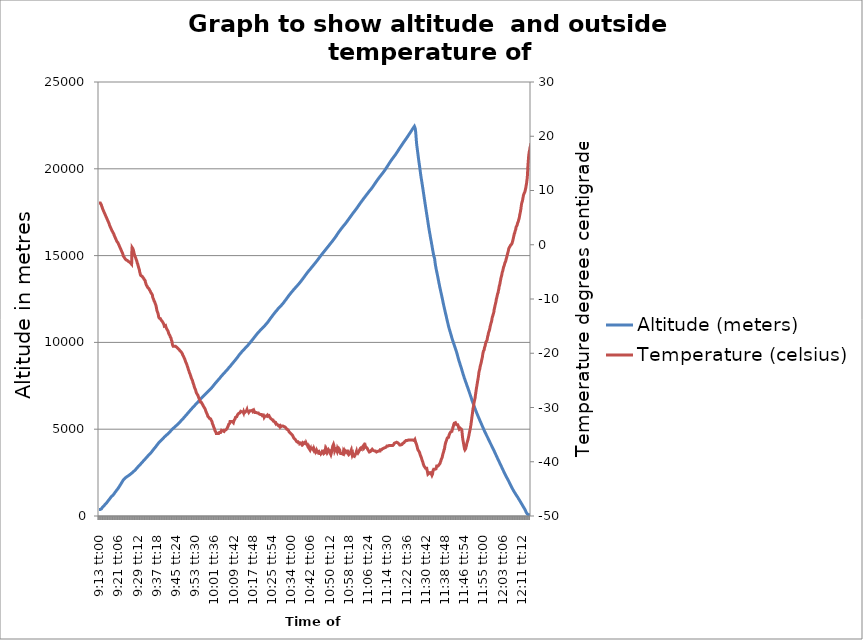
| Category | Altitude (meters)   |
|---|---|
| 0.3840277777777778 | 380 |
| 0.38409722222222226 | 380 |
| 0.3841666666666667 | 380 |
| 0.38423611111111117 | 380 |
| 0.3843055555555555 | 380 |
| 0.38437499999999997 | 380 |
| 0.3844444444444444 | 380 |
| 0.3845138888888889 | 380 |
| 0.38458333333333333 | 383 |
| 0.3846527777777778 | 399 |
| 0.384722222222222 | 414 |
| 0.384791666666667 | 437 |
| 0.384861111111111 | 460 |
| 0.384930555555556 | 481 |
| 0.385 | 501 |
| 0.385069444444445 | 513 |
| 0.385138888888889 | 529 |
| 0.385208333333334 | 540 |
| 0.385277777777778 | 552 |
| 0.385347222222222 | 566 |
| 0.385416666666667 | 584 |
| 0.385486111111111 | 598 |
| 0.385555555555556 | 613 |
| 0.385625 | 630 |
| 0.385694444444445 | 645 |
| 0.385763888888889 | 662 |
| 0.385833333333334 | 676 |
| 0.385902777777778 | 692 |
| 0.385972222222223 | 706 |
| 0.386041666666667 | 720 |
| 0.386111111111111 | 734 |
| 0.386180555555556 | 749 |
| 0.38625 | 764 |
| 0.386319444444445 | 782 |
| 0.386388888888889 | 798 |
| 0.386458333333334 | 822 |
| 0.386527777777778 | 840 |
| 0.386597222222223 | 856 |
| 0.386666666666667 | 872 |
| 0.386736111111112 | 891 |
| 0.386805555555556 | 908 |
| 0.386875 | 923 |
| 0.386944444444445 | 941 |
| 0.387013888888889 | 957 |
| 0.387083333333334 | 980 |
| 0.387152777777778 | 1004 |
| 0.387222222222223 | 1024 |
| 0.387291666666667 | 1037 |
| 0.387361111111112 | 1050 |
| 0.387430555555556 | 1070 |
| 0.387500000000001 | 1088 |
| 0.387569444444445 | 1106 |
| 0.387638888888889 | 1124 |
| 0.387708333333334 | 1138 |
| 0.387777777777778 | 1152 |
| 0.387847222222223 | 1165 |
| 0.387916666666667 | 1172 |
| 0.387986111111112 | 1179 |
| 0.388055555555556 | 1189 |
| 0.388125000000001 | 1202 |
| 0.388194444444445 | 1218 |
| 0.38826388888889 | 1238 |
| 0.388333333333334 | 1263 |
| 0.388402777777778 | 1284 |
| 0.388472222222223 | 1300 |
| 0.388541666666667 | 1318 |
| 0.388611111111112 | 1339 |
| 0.388680555555556 | 1358 |
| 0.388750000000001 | 1376 |
| 0.388819444444445 | 1389 |
| 0.38888888888889 | 1409 |
| 0.388958333333334 | 1428 |
| 0.389027777777779 | 1448 |
| 0.389097222222223 | 1465 |
| 0.389166666666667 | 1483 |
| 0.389236111111112 | 1504 |
| 0.389305555555556 | 1521 |
| 0.389375 | 1538 |
| 0.3894444444444445 | 1553 |
| 0.3895138888888889 | 1572 |
| 0.38958333333333334 | 1592 |
| 0.3896527777777778 | 1612 |
| 0.38972222222222225 | 1632 |
| 0.3897916666666667 | 1655 |
| 0.38986111111111116 | 1679 |
| 0.3899305555555555 | 1701 |
| 0.38999999999999996 | 1719 |
| 0.3900694444444444 | 1737 |
| 0.39013888888888887 | 1761 |
| 0.3902083333333333 | 1786 |
| 0.3902777777777778 | 1806 |
| 0.39034722222222223 | 1829 |
| 0.39041666666666663 | 1852 |
| 0.3904861111111111 | 1871 |
| 0.39055555555555554 | 1893 |
| 0.390625 | 1915 |
| 0.39069444444444446 | 1940 |
| 0.3907638888888889 | 1965 |
| 0.39083333333333337 | 1988 |
| 0.39090277777777777 | 2010 |
| 0.3909722222222222 | 2033 |
| 0.3910416666666667 | 2058 |
| 0.39111111111111113 | 2080 |
| 0.3911805555555556 | 2096 |
| 0.39125000000000004 | 2108 |
| 0.3913194444444445 | 2122 |
| 0.39138888888888884 | 2134 |
| 0.3914583333333333 | 2148 |
| 0.39152777777777775 | 2160 |
| 0.3915972222222222 | 2171 |
| 0.39166666666666666 | 2185 |
| 0.3917361111111111 | 2197 |
| 0.3918055555555555 | 2211 |
| 0.391875 | 2222 |
| 0.39194444444444443 | 2234 |
| 0.3920138888888889 | 2245 |
| 0.39208333333333334 | 2255 |
| 0.3921527777777778 | 2264 |
| 0.39222222222222225 | 2274 |
| 0.39229166666666665 | 2283 |
| 0.3923611111111111 | 2292 |
| 0.39243055555555556 | 2301 |
| 0.3925 | 2311 |
| 0.39256944444444447 | 2319 |
| 0.3926388888888889 | 2329 |
| 0.3927083333333334 | 2339 |
| 0.3927777777777777 | 2346 |
| 0.3928472222222222 | 2357 |
| 0.39291666666666664 | 2366 |
| 0.3929861111111111 | 2377 |
| 0.39305555555555555 | 2387 |
| 0.393125 | 2397 |
| 0.39319444444444446 | 2408 |
| 0.39326388888888886 | 2419 |
| 0.3933333333333333 | 2432 |
| 0.39340277777777777 | 2442 |
| 0.3934722222222222 | 2454 |
| 0.3935416666666667 | 2465 |
| 0.39361111111111113 | 2475 |
| 0.3936805555555556 | 2487 |
| 0.39375 | 2498 |
| 0.39381944444444444 | 2511 |
| 0.3938888888888889 | 2523 |
| 0.39395833333333335 | 2536 |
| 0.3940277777777778 | 2547 |
| 0.39409722222222227 | 2560 |
| 0.3941666666666667 | 2572 |
| 0.39423611111111106 | 2584 |
| 0.3943055555555555 | 2597 |
| 0.394375 | 2609 |
| 0.39444444444444443 | 2622 |
| 0.3945138888888889 | 2635 |
| 0.39458333333333334 | 2649 |
| 0.3946527777777778 | 2664 |
| 0.3947222222222222 | 2678 |
| 0.39479166666666665 | 2692 |
| 0.3948611111111111 | 2707 |
| 0.39493055555555556 | 2723 |
| 0.395 | 2736 |
| 0.3950694444444445 | 2751 |
| 0.3951388888888889 | 2769 |
| 0.39520833333333333 | 2786 |
| 0.3952777777777778 | 2801 |
| 0.39534722222222224 | 2820 |
| 0.3954166666666667 | 2839 |
| 0.39548611111111115 | 2855 |
| 0.3955555555555556 | 2871 |
| 0.39562499999999995 | 2885 |
| 0.3956944444444444 | 2899 |
| 0.39576388888888886 | 2912 |
| 0.3958333333333333 | 2924 |
| 0.39590277777777777 | 2937 |
| 0.3959722222222222 | 2950 |
| 0.3960416666666667 | 2963 |
| 0.3961111111111111 | 2978 |
| 0.39618055555555554 | 2993 |
| 0.39625 | 3009 |
| 0.39631944444444445 | 3024 |
| 0.3963888888888889 | 3040 |
| 0.39645833333333336 | 3056 |
| 0.3965277777777778 | 3072 |
| 0.3965972222222222 | 3086 |
| 0.39666666666666667 | 3101 |
| 0.3967361111111111 | 3116 |
| 0.3968055555555556 | 3131 |
| 0.39687500000000003 | 3147 |
| 0.3969444444444445 | 3162 |
| 0.39701388888888883 | 3177 |
| 0.3970833333333333 | 3192 |
| 0.39715277777777774 | 3207 |
| 0.3972222222222222 | 3222 |
| 0.39729166666666665 | 3236 |
| 0.3973611111111111 | 3250 |
| 0.39743055555555556 | 3265 |
| 0.39749999999999996 | 3280 |
| 0.3975694444444444 | 3297 |
| 0.3976388888888889 | 3314 |
| 0.39770833333333333 | 3329 |
| 0.3977777777777778 | 3345 |
| 0.39784722222222224 | 3359 |
| 0.3979166666666667 | 3374 |
| 0.3979861111111111 | 3389 |
| 0.39805555555555555 | 3404 |
| 0.398125 | 3419 |
| 0.39819444444444446 | 3435 |
| 0.3982638888888889 | 3451 |
| 0.3983333333333334 | 3466 |
| 0.39840277777777783 | 3480 |
| 0.39847222222222217 | 3494 |
| 0.3985416666666666 | 3508 |
| 0.3986111111111111 | 3523 |
| 0.39868055555555554 | 3538 |
| 0.39875 | 3554 |
| 0.39881944444444445 | 3568 |
| 0.3988888888888889 | 3582 |
| 0.3989583333333333 | 3594 |
| 0.39902777777777776 | 3608 |
| 0.3990972222222222 | 3622 |
| 0.39916666666666667 | 3637 |
| 0.3992361111111111 | 3653 |
| 0.3993055555555556 | 3669 |
| 0.39937500000000004 | 3687 |
| 0.39944444444444444 | 3703 |
| 0.3995138888888889 | 3724 |
| 0.39958333333333335 | 3741 |
| 0.3996527777777778 | 3759 |
| 0.39972222222222226 | 3780 |
| 0.3997916666666667 | 3795 |
| 0.39986111111111106 | 3811 |
| 0.3999305555555555 | 3826 |
| 0.39999999999999997 | 3843 |
| 0.4000694444444444 | 3861 |
| 0.4001388888888889 | 3878 |
| 0.40020833333333333 | 3895 |
| 0.4002777777777778 | 3911 |
| 0.4003472222222222 | 3928 |
| 0.40041666666666664 | 3944 |
| 0.4004861111111111 | 3962 |
| 0.40055555555555555 | 3978 |
| 0.400625 | 3997 |
| 0.40069444444444446 | 4014 |
| 0.4007638888888889 | 4033 |
| 0.4008333333333333 | 4052 |
| 0.4009027777777778 | 4072 |
| 0.40097222222222223 | 4088 |
| 0.4010416666666667 | 4107 |
| 0.40111111111111114 | 4126 |
| 0.4011805555555556 | 4141 |
| 0.40125000000000005 | 4160 |
| 0.4013194444444444 | 4175 |
| 0.40138888888888885 | 4193 |
| 0.4014583333333333 | 4213 |
| 0.40152777777777776 | 4227 |
| 0.4015972222222222 | 4242 |
| 0.40166666666666667 | 4257 |
| 0.4017361111111111 | 4271 |
| 0.4018055555555555 | 4284 |
| 0.401875 | 4298 |
| 0.40194444444444444 | 4302 |
| 0.4020138888888889 | 4327 |
| 0.40208333333333335 | 4341 |
| 0.4021527777777778 | 4355 |
| 0.40222222222222226 | 4369 |
| 0.40229166666666666 | 4382 |
| 0.4023611111111111 | 4397 |
| 0.40243055555555557 | 4409 |
| 0.4025 | 4425 |
| 0.4025694444444445 | 4439 |
| 0.40263888888888894 | 4451 |
| 0.4027083333333333 | 4463 |
| 0.40277777777777773 | 4475 |
| 0.4028472222222222 | 4489 |
| 0.40291666666666665 | 4504 |
| 0.4029861111111111 | 4521 |
| 0.40305555555555556 | 4537 |
| 0.403125 | 4552 |
| 0.4031944444444444 | 4566 |
| 0.40326388888888887 | 4579 |
| 0.4033333333333333 | 4591 |
| 0.4034027777777778 | 4602 |
| 0.40347222222222223 | 4615 |
| 0.4035416666666667 | 4626 |
| 0.40361111111111114 | 4638 |
| 0.40368055555555554 | 4649 |
| 0.40375 | 4661 |
| 0.40381944444444445 | 4673 |
| 0.4038888888888889 | 4687 |
| 0.40395833333333336 | 4699 |
| 0.4040277777777778 | 4710 |
| 0.4040972222222223 | 4722 |
| 0.4041666666666666 | 4735 |
| 0.4042361111111111 | 4748 |
| 0.40430555555555553 | 4761 |
| 0.404375 | 4775 |
| 0.40444444444444444 | 4789 |
| 0.4045138888888889 | 4803 |
| 0.40458333333333335 | 4817 |
| 0.40465277777777775 | 4830 |
| 0.4047222222222222 | 4842 |
| 0.40479166666666666 | 4855 |
| 0.4048611111111111 | 4869 |
| 0.40493055555555557 | 4887 |
| 0.405 | 4905 |
| 0.4050694444444444 | 4920 |
| 0.4051388888888889 | 4937 |
| 0.40520833333333334 | 4952 |
| 0.4052777777777778 | 4965 |
| 0.40534722222222225 | 4980 |
| 0.4054166666666667 | 4997 |
| 0.40548611111111116 | 5015 |
| 0.4055555555555555 | 5026 |
| 0.40562499999999996 | 5036 |
| 0.4056944444444444 | 5047 |
| 0.40576388888888887 | 5059 |
| 0.4058333333333333 | 5072 |
| 0.4059027777777778 | 5083 |
| 0.40597222222222223 | 5093 |
| 0.40604166666666663 | 5104 |
| 0.4061111111111111 | 5116 |
| 0.40618055555555554 | 5128 |
| 0.40625 | 5140 |
| 0.40631944444444446 | 5152 |
| 0.4063888888888889 | 5165 |
| 0.40645833333333337 | 5178 |
| 0.40652777777777777 | 5192 |
| 0.4065972222222222 | 5205 |
| 0.4066666666666667 | 5217 |
| 0.40673611111111113 | 5230 |
| 0.4068055555555556 | 5243 |
| 0.40687500000000004 | 5256 |
| 0.4069444444444445 | 5269 |
| 0.40701388888888884 | 5282 |
| 0.4070833333333333 | 5296 |
| 0.40715277777777775 | 5310 |
| 0.4072222222222222 | 5324 |
| 0.40729166666666666 | 5337 |
| 0.4073611111111111 | 5351 |
| 0.4074305555555556 | 5366 |
| 0.4075 | 5380 |
| 0.40756944444444443 | 5393 |
| 0.4076388888888889 | 5407 |
| 0.40770833333333334 | 5421 |
| 0.4077777777777778 | 5435 |
| 0.40784722222222225 | 5449 |
| 0.40791666666666665 | 5463 |
| 0.4079861111111111 | 5477 |
| 0.40805555555555556 | 5492 |
| 0.408125 | 5507 |
| 0.40819444444444447 | 5519 |
| 0.4082638888888889 | 5536 |
| 0.4083333333333334 | 5551 |
| 0.4084027777777777 | 5566 |
| 0.4084722222222222 | 5581 |
| 0.40854166666666664 | 5596 |
| 0.4086111111111111 | 5611 |
| 0.40868055555555555 | 5626 |
| 0.40875 | 5641 |
| 0.40881944444444446 | 5658 |
| 0.40888888888888886 | 5673 |
| 0.4089583333333333 | 5688 |
| 0.40902777777777777 | 5704 |
| 0.4090972222222222 | 5721 |
| 0.4091666666666667 | 5736 |
| 0.40923611111111113 | 5752 |
| 0.4093055555555556 | 5767 |
| 0.409375 | 5782 |
| 0.40944444444444444 | 5798 |
| 0.4095138888888889 | 5814 |
| 0.40958333333333335 | 5830 |
| 0.4096527777777778 | 5845 |
| 0.40972222222222227 | 5861 |
| 0.4097916666666667 | 5876 |
| 0.40986111111111106 | 5890 |
| 0.4099305555555555 | 5906 |
| 0.41 | 5922 |
| 0.41006944444444443 | 5938 |
| 0.4101388888888889 | 5956 |
| 0.41020833333333334 | 5972 |
| 0.41027777777777774 | 5988 |
| 0.4103472222222222 | 6004 |
| 0.41041666666666665 | 6020 |
| 0.4104861111111111 | 6036 |
| 0.41055555555555556 | 6050 |
| 0.410625 | 6066 |
| 0.4106944444444445 | 6081 |
| 0.4107638888888889 | 6097 |
| 0.41083333333333333 | 6114 |
| 0.4109027777777778 | 6133 |
| 0.41097222222222224 | 6148 |
| 0.4110416666666667 | 6164 |
| 0.41111111111111115 | 6178 |
| 0.4111805555555556 | 6192 |
| 0.41124999999999995 | 6206 |
| 0.4113194444444444 | 6220 |
| 0.41138888888888886 | 6235 |
| 0.4114583333333333 | 6250 |
| 0.41152777777777777 | 6266 |
| 0.4115972222222222 | 6280 |
| 0.4116666666666667 | 6294 |
| 0.4117361111111111 | 6308 |
| 0.41180555555555554 | 6324 |
| 0.411875 | 6340 |
| 0.41194444444444445 | 6354 |
| 0.4120138888888889 | 6369 |
| 0.41208333333333336 | 6384 |
| 0.4121527777777778 | 6398 |
| 0.4122222222222222 | 6413 |
| 0.41229166666666667 | 6428 |
| 0.4123611111111111 | 6441 |
| 0.4124305555555556 | 6458 |
| 0.41250000000000003 | 6472 |
| 0.4125694444444445 | 6486 |
| 0.41263888888888894 | 6501 |
| 0.4127083333333333 | 6515 |
| 0.41277777777777774 | 6529 |
| 0.4128472222222222 | 6542 |
| 0.41291666666666665 | 6558 |
| 0.4129861111111111 | 6574 |
| 0.41305555555555556 | 6591 |
| 0.41312499999999996 | 6606 |
| 0.4131944444444444 | 6623 |
| 0.4132638888888889 | 6639 |
| 0.41333333333333333 | 6653 |
| 0.4134027777777778 | 6669 |
| 0.41347222222222224 | 6684 |
| 0.4135416666666667 | 6700 |
| 0.4136111111111111 | 6715 |
| 0.41368055555555555 | 6730 |
| 0.41375 | 6744 |
| 0.41381944444444446 | 6759 |
| 0.4138888888888889 | 6773 |
| 0.4139583333333334 | 6787 |
| 0.41402777777777783 | 6801 |
| 0.41409722222222217 | 6815 |
| 0.4141666666666666 | 6830 |
| 0.4142361111111111 | 6844 |
| 0.41430555555555554 | 6856 |
| 0.414375 | 6869 |
| 0.41444444444444445 | 6883 |
| 0.4145138888888889 | 6897 |
| 0.4145833333333333 | 6911 |
| 0.41465277777777776 | 6926 |
| 0.4147222222222222 | 6940 |
| 0.41479166666666667 | 6954 |
| 0.4148611111111111 | 6966 |
| 0.4149305555555556 | 6980 |
| 0.41500000000000004 | 6993 |
| 0.41506944444444444 | 7007 |
| 0.4151388888888889 | 7020 |
| 0.41520833333333335 | 7032 |
| 0.4152777777777778 | 7045 |
| 0.41534722222222226 | 7061 |
| 0.4154166666666667 | 7075 |
| 0.41548611111111106 | 7089 |
| 0.4155555555555555 | 7103 |
| 0.41562499999999997 | 7117 |
| 0.4156944444444444 | 7132 |
| 0.4157638888888889 | 7146 |
| 0.41583333333333333 | 7157 |
| 0.4159027777777778 | 7171 |
| 0.4159722222222222 | 7182 |
| 0.41604166666666664 | 7194 |
| 0.4161111111111111 | 7209 |
| 0.41618055555555555 | 7222 |
| 0.41625 | 7235 |
| 0.41631944444444446 | 7249 |
| 0.4163888888888889 | 7262 |
| 0.4164583333333333 | 7275 |
| 0.4165277777777778 | 7289 |
| 0.41659722222222223 | 7304 |
| 0.4166666666666667 | 7318 |
| 0.41673611111111114 | 7331 |
| 0.4168055555555556 | 7345 |
| 0.41687500000000005 | 7359 |
| 0.4169444444444444 | 7376 |
| 0.41701388888888885 | 7393 |
| 0.4170833333333333 | 7412 |
| 0.41715277777777776 | 7431 |
| 0.4172222222222222 | 7445 |
| 0.41729166666666667 | 7462 |
| 0.4173611111111111 | 7476 |
| 0.4174305555555555 | 7494 |
| 0.4175 | 7511 |
| 0.41756944444444444 | 7529 |
| 0.4176388888888889 | 7545 |
| 0.41770833333333335 | 7562 |
| 0.4177777777777778 | 7580 |
| 0.41784722222222226 | 7598 |
| 0.41791666666666666 | 7616 |
| 0.4179861111111111 | 7634 |
| 0.41805555555555557 | 7648 |
| 0.418125 | 7663 |
| 0.4181944444444445 | 7678 |
| 0.41826388888888894 | 7695 |
| 0.4183333333333333 | 7713 |
| 0.41840277777777773 | 7729 |
| 0.4184722222222222 | 7745 |
| 0.41854166666666665 | 7760 |
| 0.4186111111111111 | 7775 |
| 0.41868055555555556 | 7788 |
| 0.41875 | 7805 |
| 0.4188194444444444 | 7821 |
| 0.41888888888888887 | 7838 |
| 0.4189583333333333 | 7854 |
| 0.4190277777777778 | 7873 |
| 0.41909722222222223 | 7888 |
| 0.4191666666666667 | 7902 |
| 0.41923611111111114 | 7919 |
| 0.41930555555555554 | 7933 |
| 0.419375 | 7944 |
| 0.41944444444444445 | 7963 |
| 0.4195138888888889 | 7980 |
| 0.41958333333333336 | 7998 |
| 0.4196527777777778 | 8016 |
| 0.4197222222222223 | 8035 |
| 0.4197916666666666 | 8049 |
| 0.4198611111111111 | 8064 |
| 0.41993055555555553 | 8080 |
| 0.42 | 8095 |
| 0.42006944444444444 | 8112 |
| 0.4201388888888889 | 8128 |
| 0.42020833333333335 | 8144 |
| 0.42027777777777775 | 8159 |
| 0.4203472222222222 | 8173 |
| 0.42041666666666666 | 8187 |
| 0.4204861111111111 | 8202 |
| 0.42055555555555557 | 8217 |
| 0.420625 | 8233 |
| 0.4206944444444444 | 8246 |
| 0.4207638888888889 | 8262 |
| 0.42083333333333334 | 8277 |
| 0.4209027777777778 | 8291 |
| 0.42097222222222225 | 8305 |
| 0.4210416666666667 | 8321 |
| 0.42111111111111116 | 8337 |
| 0.4211805555555555 | 8352 |
| 0.42124999999999996 | 8367 |
| 0.4213194444444444 | 8381 |
| 0.42138888888888887 | 8397 |
| 0.4214583333333333 | 8412 |
| 0.4215277777777778 | 8427 |
| 0.42159722222222223 | 8442 |
| 0.42166666666666663 | 8457 |
| 0.4217361111111111 | 8474 |
| 0.42180555555555554 | 8491 |
| 0.421875 | 8509 |
| 0.42194444444444446 | 8527 |
| 0.4220138888888889 | 8541 |
| 0.42208333333333337 | 8556 |
| 0.42215277777777777 | 8571 |
| 0.4222222222222222 | 8587 |
| 0.4222916666666667 | 8602 |
| 0.42236111111111113 | 8617 |
| 0.4224305555555556 | 8633 |
| 0.42250000000000004 | 8650 |
| 0.4225694444444445 | 8667 |
| 0.42263888888888884 | 8685 |
| 0.4227083333333333 | 8702 |
| 0.42277777777777775 | 8720 |
| 0.4228472222222222 | 8735 |
| 0.42291666666666666 | 8752 |
| 0.4229861111111111 | 8769 |
| 0.4230555555555555 | 8786 |
| 0.423125 | 8802 |
| 0.42319444444444443 | 8818 |
| 0.4232638888888889 | 8836 |
| 0.42333333333333334 | 8852 |
| 0.4234027777777778 | 8867 |
| 0.42347222222222225 | 8884 |
| 0.42354166666666665 | 8900 |
| 0.4236111111111111 | 8916 |
| 0.42368055555555556 | 8933 |
| 0.42375 | 8949 |
| 0.42381944444444447 | 8965 |
| 0.4238888888888889 | 8982 |
| 0.4239583333333334 | 8999 |
| 0.4240277777777777 | 9016 |
| 0.4240972222222222 | 9032 |
| 0.42416666666666664 | 9050 |
| 0.4242361111111111 | 9067 |
| 0.42430555555555555 | 9084 |
| 0.424375 | 9104 |
| 0.42444444444444446 | 9122 |
| 0.42451388888888886 | 9141 |
| 0.4245833333333333 | 9160 |
| 0.42465277777777777 | 9179 |
| 0.4247222222222222 | 9194 |
| 0.4247916666666667 | 9215 |
| 0.42486111111111113 | 9234 |
| 0.4249305555555556 | 9253 |
| 0.425 | 9272 |
| 0.42506944444444444 | 9288 |
| 0.4251388888888889 | 9304 |
| 0.42520833333333335 | 9321 |
| 0.4252777777777778 | 9338 |
| 0.42534722222222227 | 9354 |
| 0.4254166666666667 | 9370 |
| 0.42548611111111106 | 9385 |
| 0.4255555555555555 | 9401 |
| 0.425625 | 9416 |
| 0.42569444444444443 | 9433 |
| 0.4257638888888889 | 9453 |
| 0.42583333333333334 | 9469 |
| 0.4259027777777778 | 9485 |
| 0.4259722222222222 | 9500 |
| 0.42604166666666665 | 9514 |
| 0.4261111111111111 | 9527 |
| 0.42618055555555556 | 9541 |
| 0.42625 | 9555 |
| 0.4263194444444445 | 9570 |
| 0.4263888888888889 | 9584 |
| 0.42645833333333333 | 9599 |
| 0.4265277777777778 | 9613 |
| 0.42659722222222224 | 9628 |
| 0.4266666666666667 | 9643 |
| 0.42673611111111115 | 9655 |
| 0.4268055555555556 | 9673 |
| 0.42687499999999995 | 9686 |
| 0.4269444444444444 | 9700 |
| 0.42701388888888886 | 9714 |
| 0.4270833333333333 | 9728 |
| 0.42715277777777777 | 9742 |
| 0.4272222222222222 | 9756 |
| 0.4272916666666667 | 9771 |
| 0.4273611111111111 | 9785 |
| 0.42743055555555554 | 9800 |
| 0.4275 | 9815 |
| 0.42756944444444445 | 9832 |
| 0.4276388888888889 | 9847 |
| 0.42770833333333336 | 9864 |
| 0.4277777777777778 | 9881 |
| 0.4278472222222222 | 9898 |
| 0.42791666666666667 | 9914 |
| 0.4279861111111111 | 9929 |
| 0.4280555555555556 | 9946 |
| 0.42812500000000003 | 9961 |
| 0.4281944444444445 | 9978 |
| 0.42826388888888883 | 9995 |
| 0.4283333333333333 | 10012 |
| 0.42840277777777774 | 10030 |
| 0.4284722222222222 | 10047 |
| 0.42854166666666665 | 10062 |
| 0.4286111111111111 | 10079 |
| 0.42868055555555556 | 10097 |
| 0.42874999999999996 | 10114 |
| 0.4288194444444444 | 10131 |
| 0.4288888888888889 | 10148 |
| 0.42895833333333333 | 10165 |
| 0.4290277777777778 | 10182 |
| 0.42909722222222224 | 10201 |
| 0.4291666666666667 | 10217 |
| 0.4292361111111111 | 10234 |
| 0.42930555555555555 | 10251 |
| 0.429375 | 10269 |
| 0.42944444444444446 | 10288 |
| 0.4295138888888889 | 10307 |
| 0.4295833333333334 | 10323 |
| 0.42965277777777783 | 10341 |
| 0.42972222222222217 | 10358 |
| 0.4297916666666666 | 10376 |
| 0.4298611111111111 | 10392 |
| 0.42993055555555554 | 10408 |
| 0.43 | 10426 |
| 0.43006944444444445 | 10443 |
| 0.4301388888888889 | 10460 |
| 0.4302083333333333 | 10478 |
| 0.43027777777777776 | 10495 |
| 0.4303472222222222 | 10511 |
| 0.43041666666666667 | 10528 |
| 0.4304861111111111 | 10545 |
| 0.4305555555555556 | 10558 |
| 0.43062500000000004 | 10573 |
| 0.43069444444444444 | 10588 |
| 0.4307638888888889 | 10604 |
| 0.43083333333333335 | 10618 |
| 0.4309027777777778 | 10633 |
| 0.43097222222222226 | 10648 |
| 0.4310416666666667 | 10661 |
| 0.43111111111111117 | 10676 |
| 0.4311805555555555 | 10689 |
| 0.43124999999999997 | 10704 |
| 0.4313194444444444 | 10719 |
| 0.4313888888888889 | 10733 |
| 0.43145833333333333 | 10746 |
| 0.4315277777777778 | 10758 |
| 0.4315972222222222 | 10771 |
| 0.43166666666666664 | 10785 |
| 0.4317361111111111 | 10800 |
| 0.43180555555555555 | 10814 |
| 0.431875 | 10827 |
| 0.43194444444444446 | 10842 |
| 0.4320138888888889 | 10857 |
| 0.4320833333333333 | 10873 |
| 0.4321527777777778 | 10886 |
| 0.43222222222222223 | 10901 |
| 0.4322916666666667 | 10917 |
| 0.43236111111111114 | 10932 |
| 0.4324305555555556 | 10947 |
| 0.43250000000000005 | 10961 |
| 0.4325694444444444 | 10976 |
| 0.43263888888888885 | 10991 |
| 0.4327083333333333 | 11007 |
| 0.43277777777777776 | 11022 |
| 0.4328472222222222 | 11038 |
| 0.43291666666666667 | 11053 |
| 0.4329861111111111 | 11070 |
| 0.4330555555555555 | 11086 |
| 0.433125 | 11103 |
| 0.43319444444444444 | 11119 |
| 0.4332638888888889 | 11135 |
| 0.43333333333333335 | 11151 |
| 0.4334027777777778 | 11170 |
| 0.4334722222222222 | 11188 |
| 0.43354166666666666 | 11207 |
| 0.4336111111111111 | 11225 |
| 0.43368055555555557 | 11243 |
| 0.43375 | 11262 |
| 0.4338194444444445 | 11280 |
| 0.43388888888888894 | 11299 |
| 0.4339583333333333 | 11319 |
| 0.43402777777777773 | 11338 |
| 0.4340972222222222 | 11358 |
| 0.43416666666666665 | 11377 |
| 0.4342361111111111 | 11394 |
| 0.43430555555555556 | 11412 |
| 0.434375 | 11430 |
| 0.4344444444444444 | 11449 |
| 0.43451388888888887 | 11467 |
| 0.4345833333333333 | 11485 |
| 0.4346527777777778 | 11504 |
| 0.43472222222222223 | 11521 |
| 0.4347916666666667 | 11539 |
| 0.43486111111111114 | 11558 |
| 0.43493055555555554 | 11578 |
| 0.435 | 11596 |
| 0.43506944444444445 | 11616 |
| 0.4351388888888889 | 11633 |
| 0.43520833333333336 | 11648 |
| 0.4352777777777778 | 11664 |
| 0.4353472222222223 | 11681 |
| 0.4354166666666666 | 11698 |
| 0.4354861111111111 | 11717 |
| 0.43555555555555553 | 11736 |
| 0.435625 | 11753 |
| 0.43569444444444444 | 11769 |
| 0.4357638888888889 | 11785 |
| 0.43583333333333335 | 11801 |
| 0.43590277777777775 | 11817 |
| 0.4359722222222222 | 11833 |
| 0.43604166666666666 | 11849 |
| 0.4361111111111111 | 11863 |
| 0.43618055555555557 | 11879 |
| 0.43625 | 11896 |
| 0.4363194444444445 | 11913 |
| 0.4363888888888889 | 11931 |
| 0.43645833333333334 | 11945 |
| 0.4365277777777778 | 11958 |
| 0.43659722222222225 | 11974 |
| 0.4366666666666667 | 11989 |
| 0.43673611111111116 | 12004 |
| 0.4368055555555555 | 12018 |
| 0.43687499999999996 | 12033 |
| 0.4369444444444444 | 12048 |
| 0.43701388888888887 | 12063 |
| 0.4370833333333333 | 12077 |
| 0.4371527777777778 | 12092 |
| 0.43722222222222223 | 12105 |
| 0.43729166666666663 | 12119 |
| 0.4373611111111111 | 12133 |
| 0.43743055555555554 | 12149 |
| 0.4375 | 12164 |
| 0.43756944444444446 | 12180 |
| 0.4376388888888889 | 12196 |
| 0.43770833333333337 | 12212 |
| 0.43777777777777777 | 12226 |
| 0.4378472222222222 | 12244 |
| 0.4379166666666667 | 12261 |
| 0.43798611111111113 | 12277 |
| 0.4380555555555556 | 12294 |
| 0.43812500000000004 | 12313 |
| 0.4381944444444445 | 12332 |
| 0.43826388888888884 | 12351 |
| 0.4383333333333333 | 12369 |
| 0.43840277777777775 | 12387 |
| 0.4384722222222222 | 12405 |
| 0.43854166666666666 | 12423 |
| 0.4386111111111111 | 12441 |
| 0.4386805555555555 | 12459 |
| 0.43875 | 12478 |
| 0.43881944444444443 | 12496 |
| 0.4388888888888889 | 12514 |
| 0.43895833333333334 | 12532 |
| 0.4390277777777778 | 12551 |
| 0.43909722222222225 | 12569 |
| 0.43916666666666665 | 12589 |
| 0.4392361111111111 | 12607 |
| 0.43930555555555556 | 12627 |
| 0.439375 | 12646 |
| 0.43944444444444447 | 12666 |
| 0.4395138888888889 | 12683 |
| 0.4395833333333334 | 12701 |
| 0.4396527777777777 | 12721 |
| 0.4397222222222222 | 12738 |
| 0.43979166666666664 | 12756 |
| 0.4398611111111111 | 12773 |
| 0.43993055555555555 | 12790 |
| 0.44 | 12807 |
| 0.44006944444444446 | 12824 |
| 0.44013888888888886 | 12841 |
| 0.4402083333333333 | 12857 |
| 0.44027777777777777 | 12872 |
| 0.4403472222222222 | 12887 |
| 0.4404166666666667 | 12903 |
| 0.44048611111111113 | 12920 |
| 0.4405555555555556 | 12937 |
| 0.440625 | 12954 |
| 0.44069444444444444 | 12971 |
| 0.4407638888888889 | 12988 |
| 0.44083333333333335 | 13005 |
| 0.4409027777777778 | 13021 |
| 0.44097222222222227 | 13036 |
| 0.4410416666666667 | 13051 |
| 0.44111111111111106 | 13066 |
| 0.4411805555555555 | 13083 |
| 0.44125 | 13097 |
| 0.44131944444444443 | 13114 |
| 0.4413888888888889 | 13128 |
| 0.44145833333333334 | 13144 |
| 0.44152777777777774 | 13160 |
| 0.4415972222222222 | 13175 |
| 0.44166666666666665 | 13191 |
| 0.4417361111111111 | 13205 |
| 0.44180555555555556 | 13220 |
| 0.441875 | 13235 |
| 0.4419444444444445 | 13249 |
| 0.4420138888888889 | 13264 |
| 0.44208333333333333 | 13280 |
| 0.4421527777777778 | 13296 |
| 0.44222222222222224 | 13313 |
| 0.4422916666666667 | 13328 |
| 0.44236111111111115 | 13344 |
| 0.4424305555555556 | 13360 |
| 0.44249999999999995 | 13375 |
| 0.4425694444444444 | 13392 |
| 0.44263888888888886 | 13410 |
| 0.4427083333333333 | 13425 |
| 0.44277777777777777 | 13442 |
| 0.4428472222222222 | 13458 |
| 0.4429166666666667 | 13476 |
| 0.4429861111111111 | 13493 |
| 0.44305555555555554 | 13511 |
| 0.443125 | 13529 |
| 0.44319444444444445 | 13547 |
| 0.4432638888888889 | 13564 |
| 0.44333333333333336 | 13580 |
| 0.4434027777777778 | 13598 |
| 0.4434722222222222 | 13615 |
| 0.44354166666666667 | 13633 |
| 0.4436111111111111 | 13652 |
| 0.4436805555555556 | 13671 |
| 0.44375000000000003 | 13690 |
| 0.4438194444444445 | 13710 |
| 0.44388888888888894 | 13729 |
| 0.4439583333333333 | 13747 |
| 0.44402777777777774 | 13766 |
| 0.4440972222222222 | 13784 |
| 0.44416666666666665 | 13802 |
| 0.4442361111111111 | 13821 |
| 0.44430555555555556 | 13840 |
| 0.44437499999999996 | 13858 |
| 0.4444444444444444 | 13877 |
| 0.4445138888888889 | 13895 |
| 0.44458333333333333 | 13914 |
| 0.4446527777777778 | 13932 |
| 0.44472222222222224 | 13951 |
| 0.4447916666666667 | 13969 |
| 0.4448611111111111 | 13988 |
| 0.44493055555555555 | 14006 |
| 0.445 | 14023 |
| 0.44506944444444446 | 14041 |
| 0.4451388888888889 | 14058 |
| 0.4452083333333334 | 14077 |
| 0.44527777777777783 | 14094 |
| 0.44534722222222217 | 14112 |
| 0.4454166666666666 | 14129 |
| 0.4454861111111111 | 14145 |
| 0.44555555555555554 | 14161 |
| 0.445625 | 14176 |
| 0.44569444444444445 | 14192 |
| 0.4457638888888889 | 14205 |
| 0.4458333333333333 | 14224 |
| 0.44590277777777776 | 14241 |
| 0.4459722222222222 | 14259 |
| 0.44604166666666667 | 14275 |
| 0.4461111111111111 | 14292 |
| 0.4461805555555556 | 14308 |
| 0.44625000000000004 | 14323 |
| 0.44631944444444444 | 14338 |
| 0.4463888888888889 | 14355 |
| 0.44645833333333335 | 14370 |
| 0.4465277777777778 | 14388 |
| 0.44659722222222226 | 14405 |
| 0.4466666666666667 | 14421 |
| 0.44673611111111106 | 14439 |
| 0.4468055555555555 | 14457 |
| 0.44687499999999997 | 14475 |
| 0.4469444444444444 | 14491 |
| 0.4470138888888889 | 14509 |
| 0.44708333333333333 | 14523 |
| 0.4471527777777778 | 14541 |
| 0.4472222222222222 | 14557 |
| 0.44729166666666664 | 14575 |
| 0.4473611111111111 | 14593 |
| 0.44743055555555555 | 14610 |
| 0.4475 | 14627 |
| 0.44756944444444446 | 14643 |
| 0.4476388888888889 | 14661 |
| 0.4477083333333333 | 14679 |
| 0.4477777777777778 | 14697 |
| 0.44784722222222223 | 14715 |
| 0.4479166666666667 | 14733 |
| 0.44798611111111114 | 14752 |
| 0.4480555555555556 | 14769 |
| 0.44812500000000005 | 14787 |
| 0.4481944444444444 | 14804 |
| 0.44826388888888885 | 14822 |
| 0.4483333333333333 | 14843 |
| 0.44840277777777776 | 14861 |
| 0.4484722222222222 | 14879 |
| 0.44854166666666667 | 14898 |
| 0.4486111111111111 | 14915 |
| 0.4486805555555555 | 14933 |
| 0.44875 | 14950 |
| 0.44881944444444444 | 14968 |
| 0.4488888888888889 | 14986 |
| 0.44895833333333335 | 15003 |
| 0.4490277777777778 | 15020 |
| 0.44909722222222226 | 15039 |
| 0.44916666666666666 | 15056 |
| 0.4492361111111111 | 15074 |
| 0.44930555555555557 | 15091 |
| 0.449375 | 15108 |
| 0.4494444444444445 | 15125 |
| 0.44951388888888894 | 15142 |
| 0.4495833333333333 | 15159 |
| 0.44965277777777773 | 15177 |
| 0.4497222222222222 | 15194 |
| 0.44979166666666665 | 15211 |
| 0.4498611111111111 | 15228 |
| 0.44993055555555556 | 15245 |
| 0.45 | 15261 |
| 0.4500694444444444 | 15277 |
| 0.45013888888888887 | 15294 |
| 0.4502083333333333 | 15312 |
| 0.4502777777777778 | 15330 |
| 0.45034722222222223 | 15347 |
| 0.4504166666666667 | 15363 |
| 0.45048611111111114 | 15382 |
| 0.45055555555555554 | 15398 |
| 0.450625 | 15415 |
| 0.45069444444444445 | 15433 |
| 0.4507638888888889 | 15450 |
| 0.45083333333333336 | 15467 |
| 0.4509027777777778 | 15484 |
| 0.4509722222222223 | 15500 |
| 0.4510416666666666 | 15517 |
| 0.4511111111111111 | 15534 |
| 0.45118055555555553 | 15552 |
| 0.45125 | 15569 |
| 0.45131944444444444 | 15586 |
| 0.4513888888888889 | 15604 |
| 0.45145833333333335 | 15621 |
| 0.45152777777777775 | 15639 |
| 0.4515972222222222 | 15657 |
| 0.45166666666666666 | 15674 |
| 0.4517361111111111 | 15691 |
| 0.45180555555555557 | 15708 |
| 0.451875 | 15725 |
| 0.4519444444444444 | 15742 |
| 0.4520138888888889 | 15759 |
| 0.45208333333333334 | 15777 |
| 0.4521527777777778 | 15793 |
| 0.45222222222222225 | 15810 |
| 0.4522916666666667 | 15828 |
| 0.45236111111111116 | 15845 |
| 0.4524305555555555 | 15862 |
| 0.45249999999999996 | 15880 |
| 0.4525694444444444 | 15898 |
| 0.45263888888888887 | 15915 |
| 0.4527083333333333 | 15934 |
| 0.4527777777777778 | 15953 |
| 0.45284722222222223 | 15971 |
| 0.45291666666666663 | 15989 |
| 0.4529861111111111 | 16008 |
| 0.45305555555555554 | 16028 |
| 0.453125 | 16047 |
| 0.45319444444444446 | 16065 |
| 0.4532638888888889 | 16085 |
| 0.45333333333333337 | 16104 |
| 0.45340277777777777 | 16125 |
| 0.4534722222222222 | 16145 |
| 0.4535416666666667 | 16166 |
| 0.45361111111111113 | 16187 |
| 0.4536805555555556 | 16208 |
| 0.45375000000000004 | 16228 |
| 0.4538194444444445 | 16249 |
| 0.45388888888888884 | 16269 |
| 0.4539583333333333 | 16288 |
| 0.45402777777777775 | 16309 |
| 0.4540972222222222 | 16330 |
| 0.45416666666666666 | 16349 |
| 0.4542361111111111 | 16368 |
| 0.4543055555555556 | 16387 |
| 0.454375 | 16408 |
| 0.45444444444444443 | 16427 |
| 0.4545138888888889 | 16446 |
| 0.45458333333333334 | 16465 |
| 0.4546527777777778 | 16482 |
| 0.45472222222222225 | 16500 |
| 0.45479166666666665 | 16519 |
| 0.4548611111111111 | 16537 |
| 0.45493055555555556 | 16553 |
| 0.455 | 16570 |
| 0.45506944444444447 | 16587 |
| 0.4551388888888889 | 16604 |
| 0.4552083333333334 | 16622 |
| 0.4552777777777777 | 16640 |
| 0.4553472222222222 | 16658 |
| 0.45541666666666664 | 16675 |
| 0.4554861111111111 | 16691 |
| 0.45555555555555555 | 16708 |
| 0.455625 | 16724 |
| 0.45569444444444446 | 16741 |
| 0.45576388888888886 | 16757 |
| 0.4558333333333333 | 16774 |
| 0.45590277777777777 | 16789 |
| 0.4559722222222222 | 16806 |
| 0.4560416666666667 | 16823 |
| 0.45611111111111113 | 16840 |
| 0.4561805555555556 | 16858 |
| 0.45625 | 16875 |
| 0.45631944444444444 | 16893 |
| 0.4563888888888889 | 16911 |
| 0.45645833333333335 | 16929 |
| 0.4565277777777778 | 16949 |
| 0.45659722222222227 | 16967 |
| 0.4566666666666667 | 16986 |
| 0.45673611111111106 | 17005 |
| 0.4568055555555555 | 17025 |
| 0.456875 | 17043 |
| 0.45694444444444443 | 17062 |
| 0.4570138888888889 | 17080 |
| 0.45708333333333334 | 17101 |
| 0.45715277777777774 | 17120 |
| 0.4572222222222222 | 17138 |
| 0.45729166666666665 | 17158 |
| 0.4573611111111111 | 17177 |
| 0.45743055555555556 | 17195 |
| 0.4575 | 17215 |
| 0.4575694444444445 | 17234 |
| 0.4576388888888889 | 17251 |
| 0.45770833333333333 | 17273 |
| 0.4577777777777778 | 17291 |
| 0.45784722222222224 | 17309 |
| 0.4579166666666667 | 17328 |
| 0.45798611111111115 | 17348 |
| 0.4580555555555556 | 17366 |
| 0.45812499999999995 | 17385 |
| 0.4581944444444444 | 17404 |
| 0.45826388888888886 | 17422 |
| 0.4583333333333333 | 17440 |
| 0.45840277777777777 | 17457 |
| 0.4584722222222222 | 17475 |
| 0.4585416666666667 | 17492 |
| 0.4586111111111111 | 17510 |
| 0.45868055555555554 | 17528 |
| 0.45875 | 17545 |
| 0.45881944444444445 | 17562 |
| 0.4588888888888889 | 17580 |
| 0.45895833333333336 | 17598 |
| 0.4590277777777778 | 17614 |
| 0.4590972222222222 | 17633 |
| 0.45916666666666667 | 17651 |
| 0.4592361111111111 | 17671 |
| 0.4593055555555556 | 17691 |
| 0.45937500000000003 | 17711 |
| 0.4594444444444445 | 17729 |
| 0.45951388888888894 | 17748 |
| 0.4595833333333333 | 17768 |
| 0.45965277777777774 | 17787 |
| 0.4597222222222222 | 17805 |
| 0.45979166666666665 | 17825 |
| 0.4598611111111111 | 17845 |
| 0.45993055555555556 | 17864 |
| 0.45999999999999996 | 17881 |
| 0.4600694444444444 | 17905 |
| 0.4601388888888889 | 17926 |
| 0.46020833333333333 | 17946 |
| 0.4602777777777778 | 17965 |
| 0.46034722222222224 | 17985 |
| 0.4604166666666667 | 18004 |
| 0.4604861111111111 | 18023 |
| 0.46055555555555555 | 18041 |
| 0.460625 | 18060 |
| 0.46069444444444446 | 18077 |
| 0.4607638888888889 | 18096 |
| 0.4608333333333334 | 18114 |
| 0.46090277777777783 | 18129 |
| 0.46097222222222217 | 18151 |
| 0.4610416666666666 | 18169 |
| 0.4611111111111111 | 18188 |
| 0.46118055555555554 | 18208 |
| 0.46125 | 18227 |
| 0.46131944444444445 | 18244 |
| 0.4613888888888889 | 18264 |
| 0.4614583333333333 | 18283 |
| 0.46152777777777776 | 18301 |
| 0.4615972222222222 | 18319 |
| 0.46166666666666667 | 18336 |
| 0.4617361111111111 | 18354 |
| 0.4618055555555556 | 18373 |
| 0.46187500000000004 | 18391 |
| 0.46194444444444444 | 18409 |
| 0.4620138888888889 | 18427 |
| 0.46208333333333335 | 18445 |
| 0.4621527777777778 | 18462 |
| 0.46222222222222226 | 18479 |
| 0.4622916666666667 | 18497 |
| 0.46236111111111106 | 18515 |
| 0.4624305555555555 | 18534 |
| 0.46249999999999997 | 18551 |
| 0.4625694444444444 | 18569 |
| 0.4626388888888889 | 18586 |
| 0.46270833333333333 | 18604 |
| 0.4627777777777778 | 18622 |
| 0.4628472222222222 | 18640 |
| 0.46291666666666664 | 18658 |
| 0.4629861111111111 | 18675 |
| 0.46305555555555555 | 18693 |
| 0.463125 | 18710 |
| 0.46319444444444446 | 18727 |
| 0.4632638888888889 | 18744 |
| 0.4633333333333333 | 18760 |
| 0.4634027777777778 | 18776 |
| 0.46347222222222223 | 18793 |
| 0.4635416666666667 | 18810 |
| 0.46361111111111114 | 18826 |
| 0.4636805555555556 | 18843 |
| 0.46375000000000005 | 18862 |
| 0.4638194444444444 | 18879 |
| 0.46388888888888885 | 18897 |
| 0.4639583333333333 | 18916 |
| 0.46402777777777776 | 18935 |
| 0.4640972222222222 | 18954 |
| 0.46416666666666667 | 18974 |
| 0.4642361111111111 | 18993 |
| 0.4643055555555555 | 19013 |
| 0.464375 | 19033 |
| 0.46444444444444444 | 19054 |
| 0.4645138888888889 | 19074 |
| 0.46458333333333335 | 19095 |
| 0.4646527777777778 | 19115 |
| 0.4647222222222222 | 19135 |
| 0.46479166666666666 | 19155 |
| 0.4648611111111111 | 19175 |
| 0.46493055555555557 | 19195 |
| 0.465 | 19216 |
| 0.4650694444444445 | 19236 |
| 0.46513888888888894 | 19257 |
| 0.4652083333333333 | 19278 |
| 0.46527777777777773 | 19298 |
| 0.4653472222222222 | 19318 |
| 0.46541666666666665 | 19337 |
| 0.4654861111111111 | 19355 |
| 0.46555555555555556 | 19373 |
| 0.465625 | 19392 |
| 0.4656944444444444 | 19411 |
| 0.46576388888888887 | 19429 |
| 0.4658333333333333 | 19447 |
| 0.4659027777777778 | 19465 |
| 0.46597222222222223 | 19483 |
| 0.4660416666666667 | 19501 |
| 0.46611111111111114 | 19520 |
| 0.46618055555555554 | 19538 |
| 0.46625 | 19557 |
| 0.46631944444444445 | 19573 |
| 0.4663888888888889 | 19590 |
| 0.46645833333333336 | 19607 |
| 0.4665277777777778 | 19625 |
| 0.4665972222222223 | 19643 |
| 0.4666666666666666 | 19660 |
| 0.4667361111111111 | 19677 |
| 0.46680555555555553 | 19694 |
| 0.466875 | 19711 |
| 0.46694444444444444 | 19729 |
| 0.4670138888888889 | 19746 |
| 0.46708333333333335 | 19764 |
| 0.46715277777777775 | 19783 |
| 0.4672222222222222 | 19801 |
| 0.46729166666666666 | 19819 |
| 0.4673611111111111 | 19838 |
| 0.46743055555555557 | 19854 |
| 0.4675 | 19876 |
| 0.4675694444444445 | 19896 |
| 0.4676388888888889 | 19915 |
| 0.46770833333333334 | 19934 |
| 0.4677777777777778 | 19954 |
| 0.46784722222222225 | 19975 |
| 0.4679166666666667 | 19997 |
| 0.46798611111111116 | 20018 |
| 0.4680555555555555 | 20038 |
| 0.46812499999999996 | 20059 |
| 0.4681944444444444 | 20079 |
| 0.46826388888888887 | 20096 |
| 0.4683333333333333 | 20120 |
| 0.4684027777777778 | 20141 |
| 0.46847222222222223 | 20163 |
| 0.46854166666666663 | 20185 |
| 0.4686111111111111 | 20207 |
| 0.46868055555555554 | 20229 |
| 0.46875 | 20250 |
| 0.46881944444444446 | 20271 |
| 0.4688888888888889 | 20293 |
| 0.46895833333333337 | 20315 |
| 0.46902777777777777 | 20336 |
| 0.4690972222222222 | 20358 |
| 0.4691666666666667 | 20379 |
| 0.46923611111111113 | 20399 |
| 0.4693055555555556 | 20419 |
| 0.46937500000000004 | 20439 |
| 0.4694444444444445 | 20459 |
| 0.46951388888888884 | 20479 |
| 0.4695833333333333 | 20499 |
| 0.46965277777777775 | 20518 |
| 0.4697222222222222 | 20537 |
| 0.46979166666666666 | 20556 |
| 0.4698611111111111 | 20576 |
| 0.4699305555555555 | 20594 |
| 0.47 | 20612 |
| 0.47006944444444443 | 20630 |
| 0.4701388888888889 | 20648 |
| 0.47020833333333334 | 20666 |
| 0.4702777777777778 | 20684 |
| 0.47034722222222225 | 20703 |
| 0.47041666666666665 | 20722 |
| 0.4704861111111111 | 20739 |
| 0.47055555555555556 | 20758 |
| 0.470625 | 20776 |
| 0.47069444444444447 | 20795 |
| 0.4707638888888889 | 20814 |
| 0.4708333333333334 | 20833 |
| 0.4709027777777777 | 20853 |
| 0.4709722222222222 | 20873 |
| 0.47104166666666664 | 20894 |
| 0.4711111111111111 | 20914 |
| 0.47118055555555555 | 20935 |
| 0.47125 | 20957 |
| 0.47131944444444446 | 20978 |
| 0.47138888888888886 | 20998 |
| 0.4714583333333333 | 21018 |
| 0.47152777777777777 | 21040 |
| 0.4715972222222222 | 21060 |
| 0.4716666666666667 | 21082 |
| 0.47173611111111113 | 21104 |
| 0.4718055555555556 | 21125 |
| 0.471875 | 21146 |
| 0.47194444444444444 | 21167 |
| 0.4720138888888889 | 21188 |
| 0.47208333333333335 | 21208 |
| 0.4721527777777778 | 21229 |
| 0.47222222222222227 | 21249 |
| 0.4722916666666667 | 21269 |
| 0.47236111111111106 | 21289 |
| 0.4724305555555555 | 21309 |
| 0.4725 | 21330 |
| 0.47256944444444443 | 21350 |
| 0.4726388888888889 | 21368 |
| 0.47270833333333334 | 21393 |
| 0.4727777777777778 | 21412 |
| 0.4728472222222222 | 21434 |
| 0.47291666666666665 | 21454 |
| 0.4729861111111111 | 21474 |
| 0.47305555555555556 | 21494 |
| 0.473125 | 21513 |
| 0.4731944444444445 | 21534 |
| 0.4732638888888889 | 21554 |
| 0.47333333333333333 | 21573 |
| 0.4734027777777778 | 21592 |
| 0.47347222222222224 | 21612 |
| 0.4735416666666667 | 21628 |
| 0.47361111111111115 | 21650 |
| 0.4736805555555556 | 21670 |
| 0.47374999999999995 | 21690 |
| 0.4738194444444444 | 21710 |
| 0.47388888888888886 | 21729 |
| 0.4739583333333333 | 21749 |
| 0.47402777777777777 | 21769 |
| 0.4740972222222222 | 21789 |
| 0.4741666666666667 | 21809 |
| 0.4742361111111111 | 21828 |
| 0.47430555555555554 | 21849 |
| 0.474375 | 21870 |
| 0.47444444444444445 | 21890 |
| 0.4745138888888889 | 21911 |
| 0.47458333333333336 | 21932 |
| 0.4746527777777778 | 21952 |
| 0.4747222222222222 | 21973 |
| 0.47479166666666667 | 21993 |
| 0.4748611111111111 | 22014 |
| 0.4749305555555556 | 22034 |
| 0.47500000000000003 | 22055 |
| 0.4750694444444445 | 22076 |
| 0.47513888888888883 | 22096 |
| 0.4752083333333333 | 22118 |
| 0.47527777777777774 | 22140 |
| 0.4753472222222222 | 22160 |
| 0.47541666666666665 | 22180 |
| 0.4754861111111111 | 22200 |
| 0.47555555555555556 | 22223 |
| 0.47562499999999996 | 22245 |
| 0.4756944444444444 | 22266 |
| 0.4757638888888889 | 22289 |
| 0.47583333333333333 | 22309 |
| 0.4759027777777778 | 22330 |
| 0.47597222222222224 | 22351 |
| 0.4760416666666667 | 22372 |
| 0.4761111111111111 | 22391 |
| 0.47618055555555555 | 22410 |
| 0.47625 | 22430 |
| 0.47631944444444446 | 22449 |
| 0.4763888888888889 | 22448 |
| 0.4764583333333334 | 22404 |
| 0.47652777777777783 | 22347 |
| 0.47659722222222217 | 22278 |
| 0.4766666666666666 | 22173 |
| 0.4767361111111111 | 22017 |
| 0.47680555555555554 | 21846 |
| 0.476875 | 21657 |
| 0.47694444444444445 | 21491 |
| 0.4770138888888889 | 21365 |
| 0.4770833333333333 | 21254 |
| 0.47715277777777776 | 21151 |
| 0.4772222222222222 | 21048 |
| 0.47729166666666667 | 20941 |
| 0.4773611111111111 | 20833 |
| 0.4774305555555556 | 20725 |
| 0.47750000000000004 | 20618 |
| 0.47756944444444444 | 20516 |
| 0.4776388888888889 | 20417 |
| 0.47770833333333335 | 20319 |
| 0.4777777777777778 | 20225 |
| 0.47784722222222226 | 20126 |
| 0.4779166666666667 | 20025 |
| 0.47798611111111117 | 19922 |
| 0.4780555555555555 | 19822 |
| 0.47812499999999997 | 19720 |
| 0.4781944444444444 | 19624 |
| 0.4782638888888889 | 19529 |
| 0.47833333333333333 | 19439 |
| 0.4784027777777778 | 19352 |
| 0.4784722222222222 | 19286 |
| 0.47854166666666664 | 19181 |
| 0.4786111111111111 | 19097 |
| 0.47868055555555555 | 19010 |
| 0.47875 | 18921 |
| 0.47881944444444446 | 18831 |
| 0.4788888888888889 | 18738 |
| 0.4789583333333333 | 18645 |
| 0.4790277777777778 | 18555 |
| 0.47909722222222223 | 18462 |
| 0.4791666666666667 | 18368 |
| 0.47923611111111114 | 18275 |
| 0.4793055555555556 | 18185 |
| 0.47937500000000005 | 18097 |
| 0.4794444444444444 | 18005 |
| 0.47951388888888885 | 17912 |
| 0.4795833333333333 | 17822 |
| 0.47965277777777776 | 17733 |
| 0.4797222222222222 | 17643 |
| 0.47979166666666667 | 17554 |
| 0.4798611111111111 | 17468 |
| 0.4799305555555555 | 17380 |
| 0.48 | 17292 |
| 0.48006944444444444 | 17204 |
| 0.4801388888888889 | 17116 |
| 0.48020833333333335 | 17029 |
| 0.4802777777777778 | 16937 |
| 0.4803472222222222 | 16845 |
| 0.48041666666666666 | 16758 |
| 0.4804861111111111 | 16673 |
| 0.48055555555555557 | 16590 |
| 0.480625 | 16506 |
| 0.4806944444444445 | 16423 |
| 0.48076388888888894 | 16344 |
| 0.4808333333333333 | 16266 |
| 0.48090277777777773 | 16185 |
| 0.4809722222222222 | 16109 |
| 0.48104166666666665 | 16029 |
| 0.4811111111111111 | 15952 |
| 0.48118055555555556 | 15882 |
| 0.48125 | 15806 |
| 0.4813194444444444 | 15729 |
| 0.48138888888888887 | 15651 |
| 0.4814583333333333 | 15571 |
| 0.4815277777777778 | 15493 |
| 0.48159722222222223 | 15414 |
| 0.4816666666666667 | 15336 |
| 0.48173611111111114 | 15257 |
| 0.48180555555555554 | 15184 |
| 0.481875 | 15112 |
| 0.48194444444444445 | 15038 |
| 0.4820138888888889 | 14965 |
| 0.48208333333333336 | 14934 |
| 0.4821527777777778 | 14927 |
| 0.4822222222222223 | 14847 |
| 0.4822916666666666 | 14730 |
| 0.4823611111111111 | 14620 |
| 0.48243055555555553 | 14518 |
| 0.4825 | 14429 |
| 0.48256944444444444 | 14354 |
| 0.4826388888888889 | 14282 |
| 0.48270833333333335 | 14209 |
| 0.48277777777777775 | 14143 |
| 0.4828472222222222 | 14079 |
| 0.48291666666666666 | 14011 |
| 0.4829861111111111 | 13943 |
| 0.48305555555555557 | 13879 |
| 0.483125 | 13812 |
| 0.4831944444444444 | 13743 |
| 0.4832638888888889 | 13671 |
| 0.48333333333333334 | 13601 |
| 0.4834027777777778 | 13536 |
| 0.48347222222222225 | 13461 |
| 0.4835416666666667 | 13392 |
| 0.48361111111111116 | 13334 |
| 0.4836805555555555 | 13254 |
| 0.48374999999999996 | 13188 |
| 0.4838194444444444 | 13127 |
| 0.48388888888888887 | 13068 |
| 0.4839583333333333 | 13007 |
| 0.4840277777777778 | 12940 |
| 0.48409722222222223 | 12875 |
| 0.48416666666666663 | 12813 |
| 0.4842361111111111 | 12753 |
| 0.48430555555555554 | 12694 |
| 0.484375 | 12631 |
| 0.48444444444444446 | 12565 |
| 0.4845138888888889 | 12498 |
| 0.48458333333333337 | 12432 |
| 0.48465277777777777 | 12366 |
| 0.4847222222222222 | 12301 |
| 0.4847916666666667 | 12237 |
| 0.48486111111111113 | 12175 |
| 0.4849305555555556 | 12110 |
| 0.48500000000000004 | 12048 |
| 0.4850694444444445 | 11987 |
| 0.48513888888888884 | 11927 |
| 0.4852083333333333 | 11869 |
| 0.48527777777777775 | 11808 |
| 0.4853472222222222 | 11747 |
| 0.48541666666666666 | 11687 |
| 0.4854861111111111 | 11627 |
| 0.4855555555555556 | 11572 |
| 0.485625 | 11524 |
| 0.48569444444444443 | 11454 |
| 0.4857638888888889 | 11393 |
| 0.48583333333333334 | 11332 |
| 0.4859027777777778 | 11275 |
| 0.48597222222222225 | 11215 |
| 0.48604166666666665 | 11159 |
| 0.4861111111111111 | 11102 |
| 0.48618055555555556 | 11047 |
| 0.48625 | 10988 |
| 0.48631944444444447 | 10928 |
| 0.4863888888888889 | 10875 |
| 0.4864583333333334 | 10824 |
| 0.4865277777777777 | 10779 |
| 0.4865972222222222 | 10730 |
| 0.48666666666666664 | 10688 |
| 0.4867361111111111 | 10643 |
| 0.48680555555555555 | 10596 |
| 0.486875 | 10549 |
| 0.48694444444444446 | 10504 |
| 0.48701388888888886 | 10455 |
| 0.4870833333333333 | 10407 |
| 0.48715277777777777 | 10358 |
| 0.4872222222222222 | 10304 |
| 0.4872916666666667 | 10259 |
| 0.48736111111111113 | 10216 |
| 0.4874305555555556 | 10174 |
| 0.4875 | 10131 |
| 0.48756944444444444 | 10090 |
| 0.4876388888888889 | 10049 |
| 0.48770833333333335 | 10009 |
| 0.4877777777777778 | 9970 |
| 0.48784722222222227 | 9929 |
| 0.4879166666666667 | 9889 |
| 0.48798611111111106 | 9849 |
| 0.4880555555555555 | 9807 |
| 0.488125 | 9762 |
| 0.48819444444444443 | 9720 |
| 0.4882638888888889 | 9678 |
| 0.48833333333333334 | 9636 |
| 0.48840277777777774 | 9595 |
| 0.4884722222222222 | 9553 |
| 0.48854166666666665 | 9512 |
| 0.4886111111111111 | 9471 |
| 0.48868055555555556 | 9429 |
| 0.48875 | 9384 |
| 0.4888194444444445 | 9333 |
| 0.4888888888888889 | 9282 |
| 0.48895833333333333 | 9232 |
| 0.4890277777777778 | 9179 |
| 0.48909722222222224 | 9128 |
| 0.4891666666666667 | 9079 |
| 0.48923611111111115 | 9031 |
| 0.4893055555555556 | 8982 |
| 0.48937499999999995 | 8936 |
| 0.4894444444444444 | 8894 |
| 0.48951388888888886 | 8854 |
| 0.4895833333333333 | 8808 |
| 0.48965277777777777 | 8765 |
| 0.4897222222222222 | 8721 |
| 0.4897916666666667 | 8680 |
| 0.4898611111111111 | 8633 |
| 0.48993055555555554 | 8596 |
| 0.49 | 8554 |
| 0.49006944444444445 | 8511 |
| 0.4901388888888889 | 8464 |
| 0.49020833333333336 | 8415 |
| 0.4902777777777778 | 8368 |
| 0.4903472222222222 | 8321 |
| 0.49041666666666667 | 8273 |
| 0.4904861111111111 | 8230 |
| 0.4905555555555556 | 8183 |
| 0.49062500000000003 | 8142 |
| 0.4906944444444445 | 8100 |
| 0.49076388888888894 | 8066 |
| 0.4908333333333333 | 8011 |
| 0.49090277777777774 | 7967 |
| 0.4909722222222222 | 7926 |
| 0.49104166666666665 | 7891 |
| 0.4911111111111111 | 7852 |
| 0.49118055555555556 | 7813 |
| 0.49124999999999996 | 7773 |
| 0.4913194444444444 | 7735 |
| 0.4913888888888889 | 7697 |
| 0.49145833333333333 | 7659 |
| 0.4915277777777778 | 7620 |
| 0.49159722222222224 | 7581 |
| 0.4916666666666667 | 7544 |
| 0.4917361111111111 | 7504 |
| 0.49180555555555555 | 7463 |
| 0.491875 | 7426 |
| 0.49194444444444446 | 7386 |
| 0.4920138888888889 | 7349 |
| 0.4920833333333334 | 7310 |
| 0.49215277777777783 | 7271 |
| 0.49222222222222217 | 7232 |
| 0.4922916666666666 | 7194 |
| 0.4923611111111111 | 7153 |
| 0.49243055555555554 | 7111 |
| 0.4925 | 7068 |
| 0.49256944444444445 | 7029 |
| 0.4926388888888889 | 6989 |
| 0.4927083333333333 | 6948 |
| 0.49277777777777776 | 6904 |
| 0.4928472222222222 | 6865 |
| 0.49291666666666667 | 6825 |
| 0.4929861111111111 | 6785 |
| 0.4930555555555556 | 6742 |
| 0.49312500000000004 | 6698 |
| 0.49319444444444444 | 6657 |
| 0.4932638888888889 | 6618 |
| 0.49333333333333335 | 6581 |
| 0.4934027777777778 | 6543 |
| 0.49347222222222226 | 6505 |
| 0.4935416666666667 | 6469 |
| 0.49361111111111106 | 6431 |
| 0.4936805555555555 | 6392 |
| 0.49374999999999997 | 6353 |
| 0.4938194444444444 | 6316 |
| 0.4938888888888889 | 6286 |
| 0.49395833333333333 | 6248 |
| 0.4940277777777778 | 6208 |
| 0.4940972222222222 | 6172 |
| 0.49416666666666664 | 6136 |
| 0.4942361111111111 | 6097 |
| 0.49430555555555555 | 6061 |
| 0.494375 | 6028 |
| 0.49444444444444446 | 5994 |
| 0.4945138888888889 | 5960 |
| 0.4945833333333333 | 5926 |
| 0.4946527777777778 | 5892 |
| 0.49472222222222223 | 5859 |
| 0.4947916666666667 | 5825 |
| 0.49486111111111114 | 5792 |
| 0.4949305555555556 | 5760 |
| 0.49500000000000005 | 5728 |
| 0.4950694444444444 | 5696 |
| 0.49513888888888885 | 5665 |
| 0.4952083333333333 | 5634 |
| 0.49527777777777776 | 5602 |
| 0.4953472222222222 | 5570 |
| 0.49541666666666667 | 5538 |
| 0.4954861111111111 | 5505 |
| 0.4955555555555555 | 5473 |
| 0.495625 | 5442 |
| 0.49569444444444444 | 5411 |
| 0.4957638888888889 | 5380 |
| 0.49583333333333335 | 5349 |
| 0.4959027777777778 | 5316 |
| 0.49597222222222226 | 5285 |
| 0.49604166666666666 | 5252 |
| 0.4961111111111111 | 5219 |
| 0.49618055555555557 | 5188 |
| 0.49625 | 5158 |
| 0.4963194444444445 | 5128 |
| 0.49638888888888894 | 5097 |
| 0.4964583333333333 | 5065 |
| 0.49652777777777773 | 5033 |
| 0.4965972222222222 | 5000 |
| 0.49666666666666665 | 4969 |
| 0.4967361111111111 | 4939 |
| 0.49680555555555556 | 4910 |
| 0.496875 | 4880 |
| 0.4969444444444444 | 4850 |
| 0.49701388888888887 | 4820 |
| 0.4970833333333333 | 4791 |
| 0.4971527777777778 | 4763 |
| 0.49722222222222223 | 4735 |
| 0.4972916666666667 | 4706 |
| 0.49736111111111114 | 4678 |
| 0.49743055555555554 | 4650 |
| 0.4975 | 4623 |
| 0.49756944444444445 | 4595 |
| 0.4976388888888889 | 4568 |
| 0.49770833333333336 | 4541 |
| 0.4977777777777778 | 4513 |
| 0.4978472222222223 | 4485 |
| 0.4979166666666666 | 4457 |
| 0.4979861111111111 | 4428 |
| 0.49805555555555553 | 4398 |
| 0.498125 | 4368 |
| 0.49819444444444444 | 4339 |
| 0.4982638888888889 | 4310 |
| 0.49833333333333335 | 4282 |
| 0.49840277777777775 | 4254 |
| 0.4984722222222222 | 4227 |
| 0.49854166666666666 | 4198 |
| 0.4986111111111111 | 4171 |
| 0.49868055555555557 | 4143 |
| 0.49875 | 4115 |
| 0.4988194444444444 | 4088 |
| 0.4988888888888889 | 4060 |
| 0.49895833333333334 | 4032 |
| 0.4990277777777778 | 4005 |
| 0.49909722222222225 | 3977 |
| 0.4991666666666667 | 3949 |
| 0.49923611111111116 | 3921 |
| 0.4993055555555555 | 3893 |
| 0.49937499999999996 | 3864 |
| 0.4994444444444444 | 3835 |
| 0.49951388888888887 | 3808 |
| 0.4995833333333333 | 3780 |
| 0.4996527777777778 | 3751 |
| 0.49972222222222223 | 3721 |
| 0.49979166666666663 | 3691 |
| 0.4998611111111111 | 3662 |
| 0.49993055555555554 | 3631 |
| 0.5 | 3600 |
| 0.5000694444444445 | 3570 |
| 0.5001388888888889 | 3540 |
| 0.5002083333333334 | 3512 |
| 0.5002777777777777 | 3482 |
| 0.5003472222222222 | 3452 |
| 0.5004166666666666 | 3422 |
| 0.5004861111111111 | 3392 |
| 0.5005555555555555 | 3363 |
| 0.500625 | 3334 |
| 0.5006944444444444 | 3307 |
| 0.5007638888888889 | 3279 |
| 0.5008333333333334 | 3250 |
| 0.5009027777777778 | 3222 |
| 0.5009722222222223 | 3193 |
| 0.5010416666666667 | 3164 |
| 0.5011111111111112 | 3134 |
| 0.5011805555555556 | 3105 |
| 0.50125 | 3075 |
| 0.5013194444444444 | 3045 |
| 0.5013888888888889 | 3016 |
| 0.5014583333333333 | 2987 |
| 0.5015277777777778 | 2958 |
| 0.5015972222222222 | 2929 |
| 0.5016666666666666 | 2900 |
| 0.501736111111111 | 2871 |
| 0.5018055555555555 | 2842 |
| 0.501875 | 2813 |
| 0.5019444444444444 | 2783 |
| 0.5020138888888889 | 2753 |
| 0.5020833333333333 | 2724 |
| 0.5021527777777778 | 2695 |
| 0.5022222222222222 | 2665 |
| 0.5022916666666667 | 2637 |
| 0.5023611111111111 | 2608 |
| 0.5024305555555556 | 2580 |
| 0.5025000000000001 | 2552 |
| 0.5025694444444445 | 2524 |
| 0.5026388888888889 | 2496 |
| 0.5027083333333333 | 2469 |
| 0.5027777777777778 | 2442 |
| 0.5028472222222222 | 2414 |
| 0.5029166666666667 | 2387 |
| 0.5029861111111111 | 2359 |
| 0.5030555555555556 | 2332 |
| 0.5031249999999999 | 2304 |
| 0.5031944444444444 | 2277 |
| 0.5032638888888888 | 2250 |
| 0.5033333333333333 | 2224 |
| 0.5034027777777778 | 2198 |
| 0.5034722222222222 | 2172 |
| 0.5035416666666667 | 2147 |
| 0.5036111111111111 | 2121 |
| 0.5036805555555556 | 2095 |
| 0.50375 | 2070 |
| 0.5038194444444445 | 2045 |
| 0.5038888888888889 | 2020 |
| 0.5039583333333334 | 1994 |
| 0.5040277777777777 | 1966 |
| 0.5040972222222222 | 1938 |
| 0.5041666666666667 | 1910 |
| 0.5042361111111111 | 1884 |
| 0.5043055555555556 | 1850 |
| 0.504375 | 1824 |
| 0.5044444444444445 | 1799 |
| 0.5045138888888888 | 1770 |
| 0.5045833333333333 | 1743 |
| 0.5046527777777777 | 1715 |
| 0.5047222222222222 | 1687 |
| 0.5047916666666666 | 1659 |
| 0.5048611111111111 | 1633 |
| 0.5049305555555555 | 1608 |
| 0.505 | 1582 |
| 0.5050694444444445 | 1554 |
| 0.5051388888888889 | 1530 |
| 0.5052083333333334 | 1506 |
| 0.5052777777777778 | 1482 |
| 0.5053472222222223 | 1458 |
| 0.5054166666666667 | 1436 |
| 0.5054861111111111 | 1412 |
| 0.5055555555555555 | 1389 |
| 0.505625 | 1366 |
| 0.5056944444444444 | 1344 |
| 0.5057638888888889 | 1322 |
| 0.5058333333333334 | 1299 |
| 0.5059027777777778 | 1277 |
| 0.5059722222222222 | 1254 |
| 0.5060416666666666 | 1232 |
| 0.5061111111111111 | 1211 |
| 0.5061805555555555 | 1190 |
| 0.50625 | 1170 |
| 0.5063194444444444 | 1148 |
| 0.5063888888888889 | 1128 |
| 0.5064583333333333 | 1106 |
| 0.5065277777777778 | 1085 |
| 0.5065972222222223 | 1068 |
| 0.5066666666666667 | 1043 |
| 0.5067361111111112 | 1021 |
| 0.5068055555555556 | 998 |
| 0.506875 | 978 |
| 0.5069444444444444 | 956 |
| 0.5070138888888889 | 932 |
| 0.5070833333333333 | 908 |
| 0.5071527777777778 | 886 |
| 0.5072222222222222 | 863 |
| 0.5072916666666667 | 839 |
| 0.507361111111111 | 816 |
| 0.5074305555555555 | 793 |
| 0.5075 | 769 |
| 0.5075694444444444 | 746 |
| 0.5076388888888889 | 722 |
| 0.5077083333333333 | 697 |
| 0.5077777777777778 | 675 |
| 0.5078472222222222 | 653 |
| 0.5079166666666667 | 631 |
| 0.5079861111111111 | 605 |
| 0.5080555555555556 | 580 |
| 0.508125 | 558 |
| 0.5081944444444445 | 536 |
| 0.508263888888889 | 514 |
| 0.5083333333333333 | 490 |
| 0.5084027777777778 | 469 |
| 0.5084722222222222 | 447 |
| 0.5085416666666667 | 426 |
| 0.5086111111111111 | 402 |
| 0.5086805555555556 | 376 |
| 0.50875 | 348 |
| 0.5088194444444444 | 316 |
| 0.5088888888888888 | 286 |
| 0.5089583333333333 | 256 |
| 0.5090277777777777 | 224 |
| 0.5090972222222222 | 197 |
| 0.5091666666666667 | 172 |
| 0.5092361111111111 | 148 |
| 0.5093055555555556 | 131 |
| 0.509375 | 111 |
| 0.5094444444444445 | 87 |
| 0.5095138888888889 | 79 |
| 0.5095833333333334 | 79 |
| 0.5096527777777778 | 79 |
| 0.5097222222222222 | 79 |
| 0.5097916666666666 | 79 |
| 0.5098611111111111 | 79 |
| 0.5099305555555556 | 79 |
| 0.51 | 79 |
| 0.5100694444444445 | 79 |
| 0.5101388888888889 | 79 |
| 0.5102083333333333 | 79 |
| 0.5102777777777777 | 79 |
| 0.5103472222222222 | 79 |
| 0.5104166666666666 | 79 |